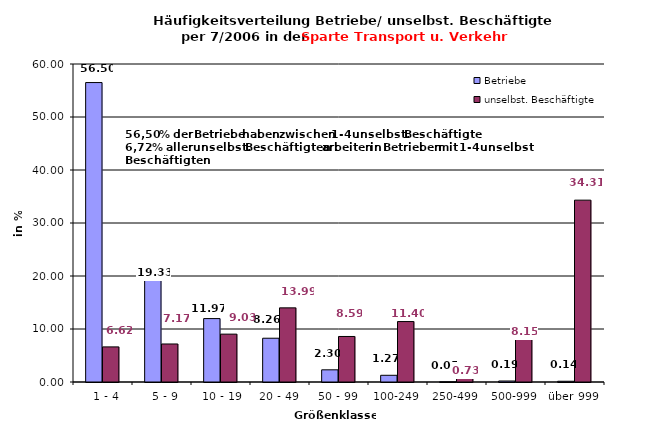
| Category | Betriebe | unselbst. Beschäftigte |
|---|---|---|
|   1 - 4 | 56.499 | 6.623 |
|   5 - 9 | 19.334 | 7.173 |
|  10 - 19 | 11.966 | 9.032 |
| 20 - 49 | 8.259 | 13.986 |
| 50 - 99 | 2.299 | 8.59 |
| 100-249 | 1.267 | 11.405 |
| 250-499 | 0.047 | 0.726 |
| 500-999 | 0.188 | 8.153 |
| über 999 | 0.141 | 34.312 |